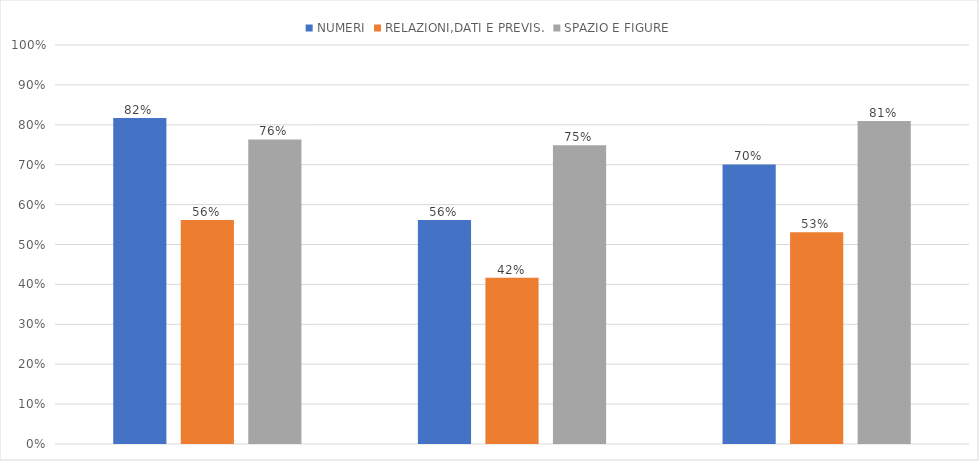
| Category | NUMERI | RELAZIONI,DATI E PREVIS. | SPAZIO E FIGURE |
|---|---|---|---|
| 1A Vivaldi | 0.817 | 0.561 | 0.763 |
| 1B Vivaldi | 0.561 | 0.417 | 0.749 |
| 1C Vivaldi | 0.701 | 0.531 | 0.809 |